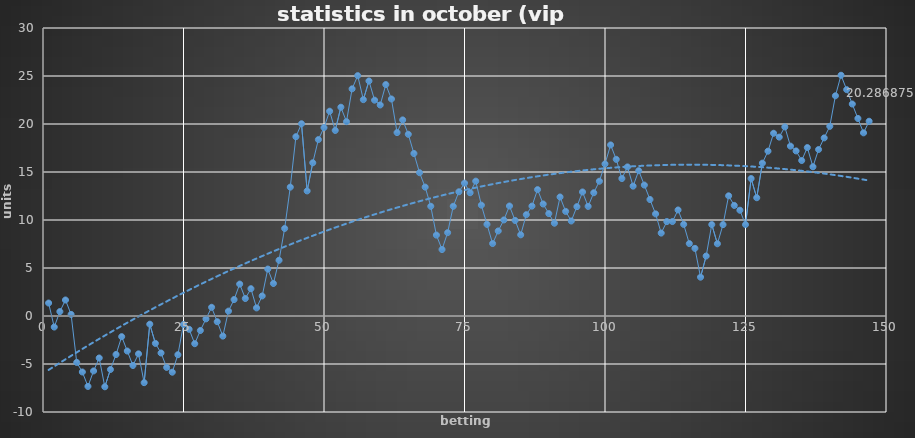
| Category | Series 0 |
|---|---|
| 0 | 1.35 |
| 1 | -1.15 |
| 2 | 0.46 |
| 3 | 1.667 |
| 4 | 0.167 |
| 5 | -4.833 |
| 6 | -5.833 |
| 7 | -7.333 |
| 8 | -5.723 |
| 9 | -4.373 |
| 10 | -7.373 |
| 11 | -5.573 |
| 12 | -4.01 |
| 13 | -2.15 |
| 14 | -3.65 |
| 15 | -5.15 |
| 16 | -3.943 |
| 17 | -6.943 |
| 18 | -0.853 |
| 19 | -2.853 |
| 20 | -3.853 |
| 21 | -5.353 |
| 22 | -5.853 |
| 23 | -4.033 |
| 24 | -0.883 |
| 25 | -1.383 |
| 26 | -2.883 |
| 27 | -1.508 |
| 28 | -0.3 |
| 29 | 0.907 |
| 30 | -0.593 |
| 31 | -2.093 |
| 32 | 0.507 |
| 33 | 1.715 |
| 34 | 3.325 |
| 35 | 1.825 |
| 36 | 2.845 |
| 37 | 0.845 |
| 38 | 2.088 |
| 39 | 4.888 |
| 40 | 3.388 |
| 41 | 5.803 |
| 42 | 9.118 |
| 43 | 13.423 |
| 44 | 18.678 |
| 45 | 20.028 |
| 46 | 13.028 |
| 47 | 15.963 |
| 48 | 18.378 |
| 49 | 19.628 |
| 50 | 21.333 |
| 51 | 19.333 |
| 52 | 21.748 |
| 53 | 20.248 |
| 54 | 23.664 |
| 55 | 25.039 |
| 56 | 22.539 |
| 57 | 24.484 |
| 58 | 22.484 |
| 59 | 21.984 |
| 60 | 24.107 |
| 61 | 22.607 |
| 62 | 19.107 |
| 63 | 20.428 |
| 64 | 18.928 |
| 65 | 16.928 |
| 66 | 14.928 |
| 67 | 13.428 |
| 68 | 11.428 |
| 69 | 8.428 |
| 70 | 6.928 |
| 71 | 8.681 |
| 72 | 11.431 |
| 73 | 12.941 |
| 74 | 13.841 |
| 75 | 12.841 |
| 76 | 14.048 |
| 77 | 11.548 |
| 78 | 9.548 |
| 79 | 7.548 |
| 80 | 8.858 |
| 81 | 10.008 |
| 82 | 11.458 |
| 83 | 9.958 |
| 84 | 8.458 |
| 85 | 10.558 |
| 86 | 11.448 |
| 87 | 13.168 |
| 88 | 11.668 |
| 89 | 10.668 |
| 90 | 9.668 |
| 91 | 12.398 |
| 92 | 10.898 |
| 93 | 9.898 |
| 94 | 11.39 |
| 95 | 12.92 |
| 96 | 11.42 |
| 97 | 12.84 |
| 98 | 14.04 |
| 99 | 15.84 |
| 100 | 17.82 |
| 101 | 16.32 |
| 102 | 14.32 |
| 103 | 15.528 |
| 104 | 13.528 |
| 105 | 15.138 |
| 106 | 13.638 |
| 107 | 12.138 |
| 108 | 10.638 |
| 109 | 8.638 |
| 110 | 9.838 |
| 111 | 9.838 |
| 112 | 11.045 |
| 113 | 9.545 |
| 114 | 7.545 |
| 115 | 7.045 |
| 116 | 4.045 |
| 117 | 6.245 |
| 118 | 9.525 |
| 119 | 7.525 |
| 120 | 9.52 |
| 121 | 12.52 |
| 122 | 11.52 |
| 123 | 11.02 |
| 124 | 9.52 |
| 125 | 14.32 |
| 126 | 12.32 |
| 127 | 15.92 |
| 128 | 17.17 |
| 129 | 19.035 |
| 130 | 18.635 |
| 131 | 19.696 |
| 132 | 17.696 |
| 133 | 17.196 |
| 134 | 16.196 |
| 135 | 17.546 |
| 136 | 15.546 |
| 137 | 17.344 |
| 138 | 18.552 |
| 139 | 19.759 |
| 140 | 22.939 |
| 141 | 25.079 |
| 142 | 23.579 |
| 143 | 22.079 |
| 144 | 20.579 |
| 145 | 19.079 |
| 146 | 20.287 |